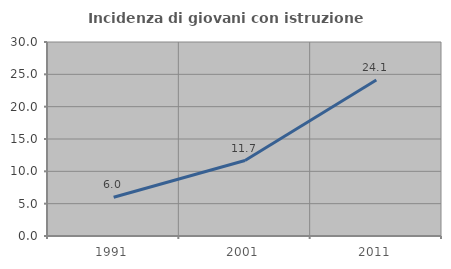
| Category | Incidenza di giovani con istruzione universitaria |
|---|---|
| 1991.0 | 5.993 |
| 2001.0 | 11.667 |
| 2011.0 | 24.116 |